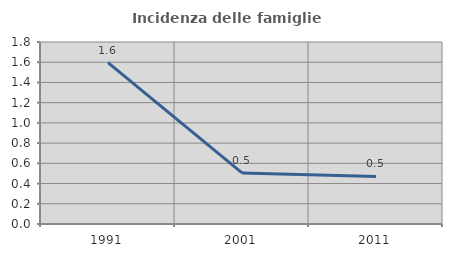
| Category | Incidenza delle famiglie numerose |
|---|---|
| 1991.0 | 1.596 |
| 2001.0 | 0.505 |
| 2011.0 | 0.471 |